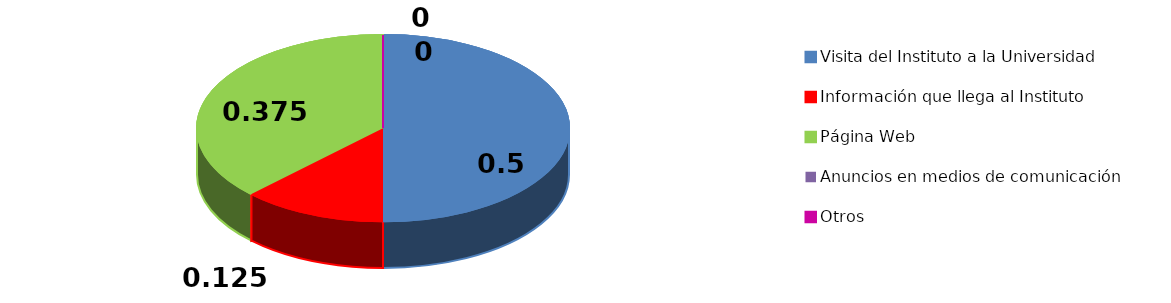
| Category | Series 0 |
|---|---|
| Visita del Instituto a la Universidad | 4 |
| Información que llega al Instituto | 1 |
| Página Web | 3 |
| Anuncios en medios de comunicación | 0 |
| Otros | 0 |